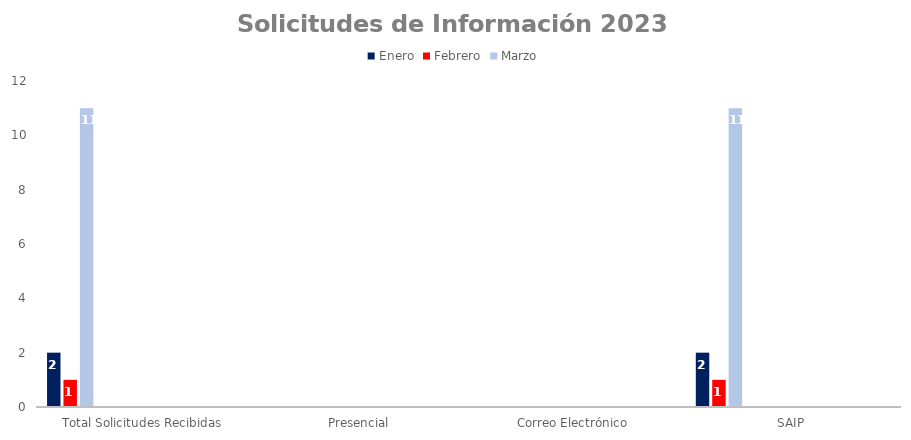
| Category | Enero | Febrero | Marzo | Abril | Mayo | Junio | Julio | Agosto | Septiembre | Octubre | Noviembre | Diciembre |
|---|---|---|---|---|---|---|---|---|---|---|---|---|
| Total Solicitudes Recibidas | 2 | 1 | 11 | 0 | 0 | 0 | 0 | 0 | 0 | 0 | 0 | 0 |
| Presencial | 0 | 0 | 0 | 0 | 0 | 0 | 0 | 0 | 0 | 0 | 0 | 0 |
| Correo Electrónico  | 0 | 0 | 0 | 0 | 0 | 0 | 0 | 0 | 0 | 0 | 0 | 0 |
| SAIP | 2 | 1 | 11 | 0 | 0 | 0 | 0 | 0 | 0 | 0 | 0 | 0 |